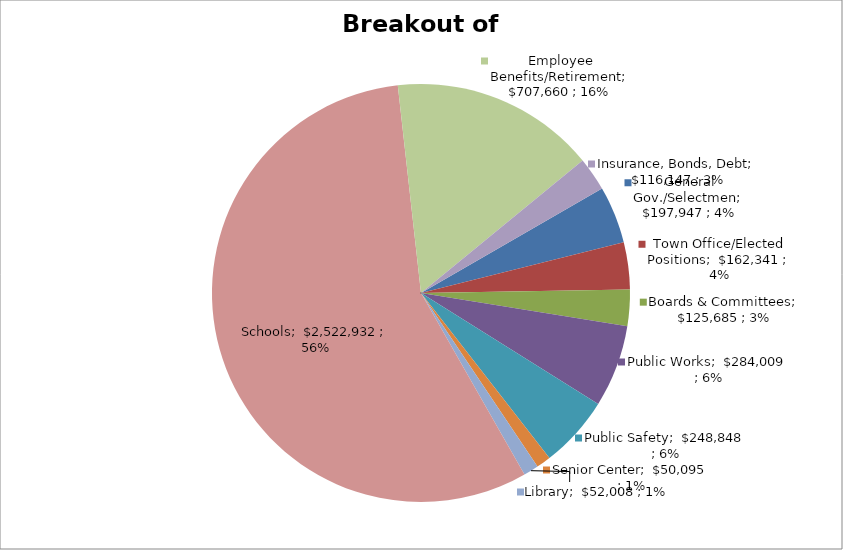
| Category | Amount |
|---|---|
| General Gov./Selectmen | 197946.697 |
| Town Office/Elected Positions | 162340.562 |
| Boards & Committees | 125684.602 |
| Public Works | 284009.015 |
| Public Safety | 248847.618 |
| Senior Center | 50094.804 |
| Library | 52008 |
| Schools | 2522932 |
| Employee Benefits/Retirement | 707660.2 |
| Insurance, Bonds, Debt | 116147 |